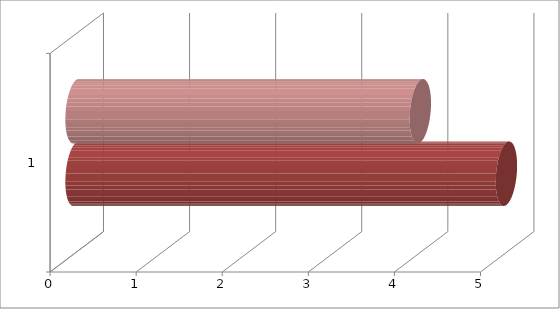
| Category | MASCULINO | FEMENINO |
|---|---|---|
| 0 | 5 | 4 |